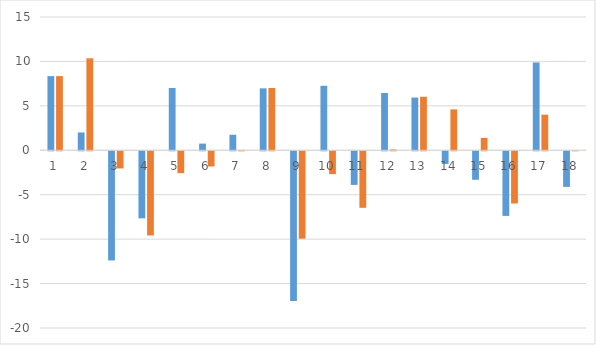
| Category | Difference | Series 1 |
|---|---|---|
| 0 | 8.346 | 8.346 |
| 1 | 2.009 | 10.355 |
| 2 | -12.284 | -1.93 |
| 3 | -7.545 | -9.475 |
| 4 | 7.014 | -2.461 |
| 5 | 0.752 | -1.709 |
| 6 | 1.75 | 0.04 |
| 7 | 6.972 | 7.012 |
| 8 | -16.844 | -9.832 |
| 9 | 7.258 | -2.573 |
| 10 | -3.784 | -6.358 |
| 11 | 6.45 | 0.092 |
| 12 | 5.936 | 6.028 |
| 13 | -1.425 | 4.602 |
| 14 | -3.207 | 1.396 |
| 15 | -7.274 | -5.878 |
| 16 | 9.886 | 4.007 |
| 17 | -4.007 | 0 |